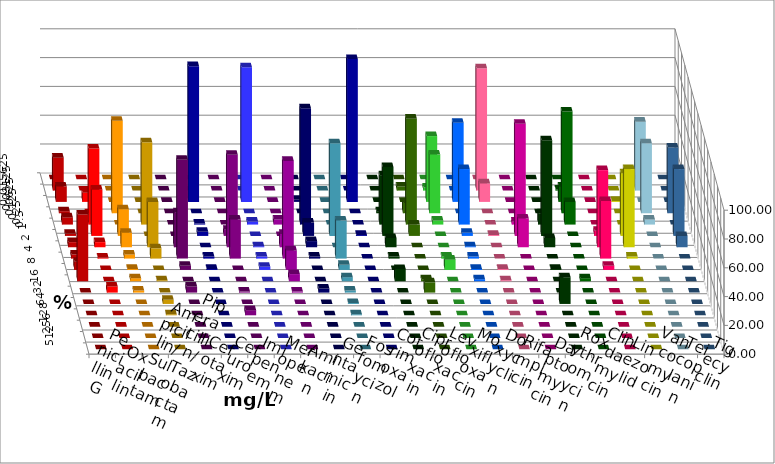
| Category | Penicillin G | Oxacillin | Ampicillin/ Sulbactam | Piperacillin/ Tazobactam | Cefotaxim | Cefuroxim | Imipenem | Meropenem | Amikacin | Gentamicin | Fosfomycin | Cotrimoxazol | Ciprofloxacin | Levofloxacin | Moxifloxacin | Doxycyclin | Rifampicin | Daptomycin | Roxythromycin | Clindamycin | Linezolid | Vancomycin | Teicoplanin | Tigecyclin |
|---|---|---|---|---|---|---|---|---|---|---|---|---|---|---|---|---|---|---|---|---|---|---|---|---|
| 0.015625 | 0 | 0 | 0 | 0 | 0 | 0 | 0 | 0 | 0 | 0 | 0 | 0 | 0 | 0 | 0 | 0 | 0 | 0 | 0 | 0 | 0 | 0 | 0 | 0 |
| 0.03125 | 22.857 | 0 | 0 | 0 | 0 | 0 | 0 | 0 | 0 | 0 | 0 | 0 | 0 | 2.857 | 2.143 | 0 | 85 | 0 | 0 | 0.714 | 0 | 0 | 0 | 47.857 |
| 0.0625 | 10.714 | 6.429 | 0 | 0 | 0 | 0 | 94.286 | 93.571 | 0 | 1.429 | 0 | 99.286 | 0 | 0 | 45.714 | 55 | 12.857 | 0 | 0 | 10.714 | 0 | 0.714 | 0 | 0 |
| 0.125 | 1.429 | 0 | 64.286 | 0 | 0 | 0 | 0 | 0 | 0 | 0 | 0 | 0 | 1.429 | 7.143 | 40.714 | 0 | 0 | 0 | 0 | 70.714 | 0 | 0 | 45.714 | 48.571 |
| 0.25 | 5 | 52.857 | 0 | 57.143 | 0 | 0 | 0.714 | 2.143 | 3.571 | 80.714 | 0 | 0 | 34.286 | 73.571 | 2.857 | 38.571 | 0 | 2.143 | 7.857 | 15.714 | 0 | 0 | 0 | 3.571 |
| 0.5 | 1.429 | 32.143 | 18.571 | 0 | 0 | 4.286 | 2.857 | 0 | 0 | 9.286 | 64.286 | 0.714 | 47.857 | 7.857 | 0 | 2.143 | 0.714 | 77.857 | 66.429 | 0 | 3.571 | 43.571 | 46.429 | 0 |
| 1.0 | 3.571 | 3.571 | 10 | 31.429 | 24.286 | 64.286 | 0 | 0.714 | 9.286 | 4.286 | 0 | 0 | 6.429 | 0 | 0 | 0.714 | 0 | 20 | 6.429 | 0 | 53.571 | 54.286 | 7.857 | 0 |
| 2.0 | 2.857 | 0.714 | 2.857 | 7.143 | 68.571 | 27.143 | 1.429 | 1.429 | 67.857 | 1.429 | 26.429 | 0 | 1.429 | 0 | 1.429 | 1.429 | 0 | 0 | 0 | 0 | 40 | 1.429 | 0 | 0 |
| 4.0 | 5.714 | 0 | 0.714 | 0 | 2.857 | 0 | 0.714 | 2.143 | 13.571 | 0 | 3.571 | 0 | 0 | 0 | 7.143 | 0.714 | 0.714 | 0 | 0.714 | 0 | 2.857 | 0 | 0 | 0 |
| 8.0 | 46.429 | 0 | 2.143 | 0.714 | 0 | 0 | 0 | 0 | 5 | 0 | 2.857 | 0 | 8.571 | 1.429 | 0 | 1.429 | 0.714 | 0 | 0 | 2.143 | 0 | 0 | 0 | 0 |
| 16.0 | 0 | 4.286 | 1.429 | 0 | 4.286 | 0.714 | 0 | 0 | 0.714 | 2.857 | 1.429 | 0 | 0 | 7.143 | 0 | 0 | 0 | 0 | 0 | 0 | 0 | 0 | 0 | 0 |
| 32.0 | 0 | 0 | 0 | 2.857 | 0 | 0 | 0 | 0 | 0 | 0 | 0.714 | 0 | 0 | 0 | 0 | 0 | 0 | 0 | 18.571 | 0 | 0 | 0 | 0 | 0 |
| 64.0 | 0 | 0 | 0 | 0.714 | 0 | 3.571 | 0 | 0 | 0 | 0 | 0.714 | 0 | 0 | 0 | 0 | 0 | 0 | 0 | 0 | 0 | 0 | 0 | 0 | 0 |
| 128.0 | 0 | 0 | 0 | 0 | 0 | 0 | 0 | 0 | 0 | 0 | 0 | 0 | 0 | 0 | 0 | 0 | 0 | 0 | 0 | 0 | 0 | 0 | 0 | 0 |
| 256.0 | 0 | 0 | 0 | 0 | 0 | 0 | 0 | 0 | 0 | 0 | 0 | 0 | 0 | 0 | 0 | 0 | 0 | 0 | 0 | 0 | 0 | 0 | 0 | 0 |
| 512.0 | 0 | 0 | 0 | 0 | 0 | 0 | 0 | 0 | 0 | 0 | 0 | 0 | 0 | 0 | 0 | 0 | 0 | 0 | 0 | 0 | 0 | 0 | 0 | 0 |